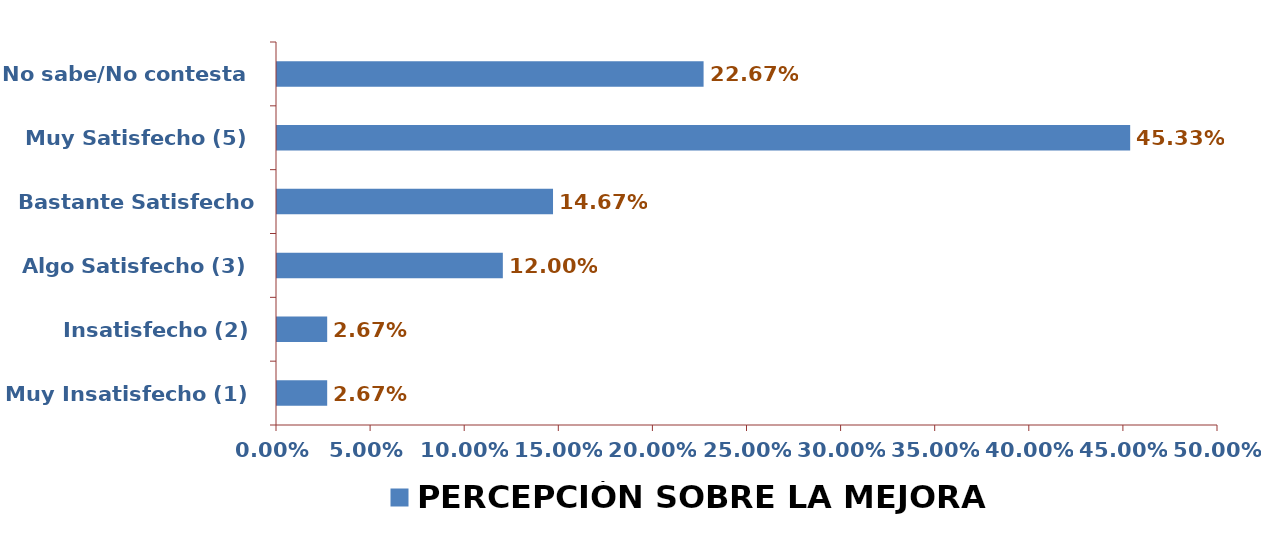
| Category | PERCEPCIÓN SOBRE LA MEJORA |
|---|---|
| Muy Insatisfecho (1) | 0.027 |
| Insatisfecho (2) | 0.027 |
| Algo Satisfecho (3) | 0.12 |
| Bastante Satisfecho (4) | 0.147 |
| Muy Satisfecho (5) | 0.453 |
| No sabe/No contesta | 0.227 |